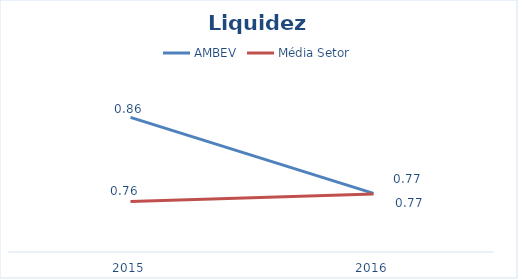
| Category | AMBEV | Média Setor |
|---|---|---|
| 2015.0 | 0.86 | 0.76 |
| 2016.0 | 0.77 | 0.769 |